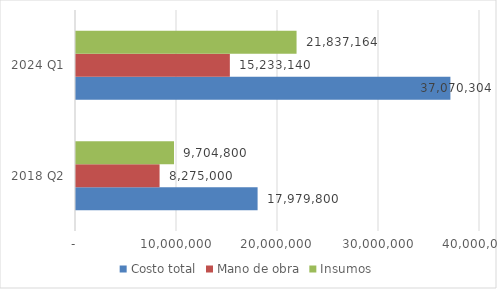
| Category | Costo total | Mano de obra | Insumos |
|---|---|---|---|
| 2018 Q2 | 17979800 | 8275000 | 9704800 |
| 2024 Q1 | 37070304.477 | 15233140 | 21837164.477 |